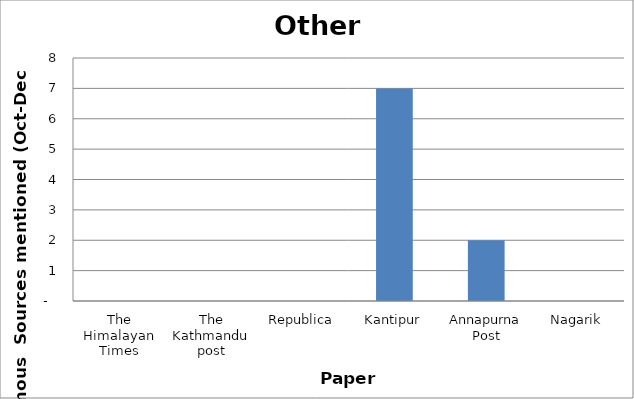
| Category | Others |
|---|---|
| The Himalayan Times | 0 |
| The Kathmandu post | 0 |
| Republica | 0 |
| Kantipur | 7 |
| Annapurna Post | 2 |
| Nagarik | 0 |